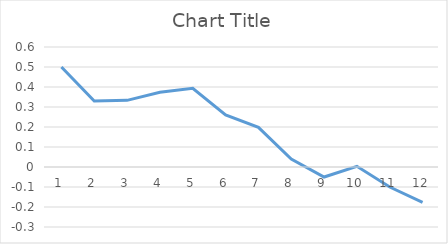
| Category | Series 0 |
|---|---|
| 0 | 0.5 |
| 1 | 0.33 |
| 2 | 0.333 |
| 3 | 0.373 |
| 4 | 0.393 |
| 5 | 0.26 |
| 6 | 0.198 |
| 7 | 0.04 |
| 8 | -0.05 |
| 9 | 0.003 |
| 10 | -0.1 |
| 11 | -0.177 |